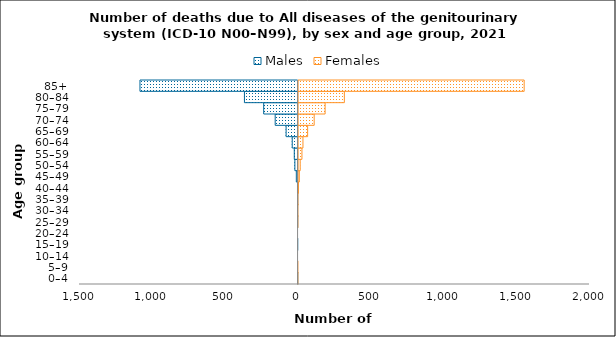
| Category | Males | Females |
|---|---|---|
| 0–4 | -1 | 1 |
| 5–9 | 0 | 1 |
| 10–14 | 0 | 0 |
| 15–19 | -1 | 0 |
| 20–24 | 0 | 0 |
| 25–29 | -2 | 1 |
| 30–34 | -3 | 1 |
| 35–39 | -2 | 2 |
| 40–44 | -4 | 6 |
| 45–49 | -12 | 12 |
| 50–54 | -22 | 18 |
| 55–59 | -26 | 30 |
| 60–64 | -40 | 37 |
| 65–69 | -82 | 69 |
| 70–74 | -157 | 114 |
| 75–79 | -236 | 189 |
| 80–84 | -368 | 321 |
| 85+ | -1085 | 1555 |